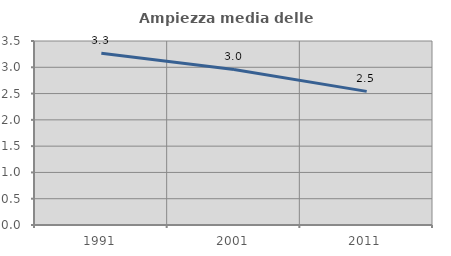
| Category | Ampiezza media delle famiglie |
|---|---|
| 1991.0 | 3.265 |
| 2001.0 | 2.959 |
| 2011.0 | 2.542 |